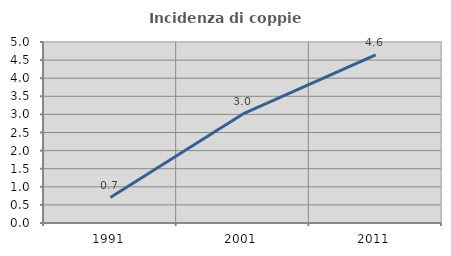
| Category | Incidenza di coppie miste |
|---|---|
| 1991.0 | 0.704 |
| 2001.0 | 3.013 |
| 2011.0 | 4.646 |